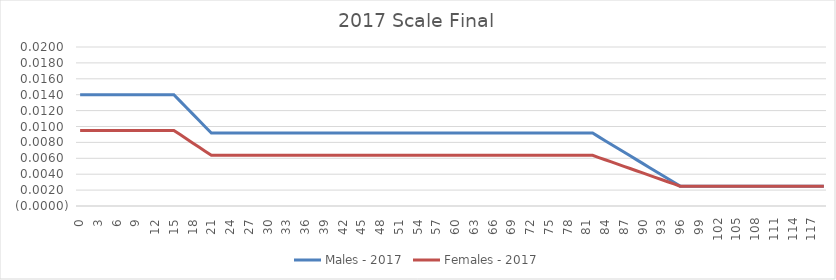
| Category | Males - 2017 | Females - 2017 |
|---|---|---|
| 0.0 | 0.014 | 0.01 |
| 1.0 | 0.014 | 0.01 |
| 2.0 | 0.014 | 0.01 |
| 3.0 | 0.014 | 0.01 |
| 4.0 | 0.014 | 0.01 |
| 5.0 | 0.014 | 0.01 |
| 6.0 | 0.014 | 0.01 |
| 7.0 | 0.014 | 0.01 |
| 8.0 | 0.014 | 0.01 |
| 9.0 | 0.014 | 0.01 |
| 10.0 | 0.014 | 0.01 |
| 11.0 | 0.014 | 0.01 |
| 12.0 | 0.014 | 0.01 |
| 13.0 | 0.014 | 0.01 |
| 14.0 | 0.014 | 0.01 |
| 15.0 | 0.014 | 0.01 |
| 16.0 | 0.013 | 0.009 |
| 17.0 | 0.012 | 0.008 |
| 18.0 | 0.012 | 0.008 |
| 19.0 | 0.011 | 0.007 |
| 20.0 | 0.01 | 0.007 |
| 21.0 | 0.009 | 0.006 |
| 22.0 | 0.009 | 0.006 |
| 23.0 | 0.009 | 0.006 |
| 24.0 | 0.009 | 0.006 |
| 25.0 | 0.009 | 0.006 |
| 26.0 | 0.009 | 0.006 |
| 27.0 | 0.009 | 0.006 |
| 28.0 | 0.009 | 0.006 |
| 29.0 | 0.009 | 0.006 |
| 30.0 | 0.009 | 0.006 |
| 31.0 | 0.009 | 0.006 |
| 32.0 | 0.009 | 0.006 |
| 33.0 | 0.009 | 0.006 |
| 34.0 | 0.009 | 0.006 |
| 35.0 | 0.009 | 0.006 |
| 36.0 | 0.009 | 0.006 |
| 37.0 | 0.009 | 0.006 |
| 38.0 | 0.009 | 0.006 |
| 39.0 | 0.009 | 0.006 |
| 40.0 | 0.009 | 0.006 |
| 41.0 | 0.009 | 0.006 |
| 42.0 | 0.009 | 0.006 |
| 43.0 | 0.009 | 0.006 |
| 44.0 | 0.009 | 0.006 |
| 45.0 | 0.009 | 0.006 |
| 46.0 | 0.009 | 0.006 |
| 47.0 | 0.009 | 0.006 |
| 48.0 | 0.009 | 0.006 |
| 49.0 | 0.009 | 0.006 |
| 50.0 | 0.009 | 0.006 |
| 51.0 | 0.009 | 0.006 |
| 52.0 | 0.009 | 0.006 |
| 53.0 | 0.009 | 0.006 |
| 54.0 | 0.009 | 0.006 |
| 55.0 | 0.009 | 0.006 |
| 56.0 | 0.009 | 0.006 |
| 57.0 | 0.009 | 0.006 |
| 58.0 | 0.009 | 0.006 |
| 59.0 | 0.009 | 0.006 |
| 60.0 | 0.009 | 0.006 |
| 61.0 | 0.009 | 0.006 |
| 62.0 | 0.009 | 0.006 |
| 63.0 | 0.009 | 0.006 |
| 64.0 | 0.009 | 0.006 |
| 65.0 | 0.009 | 0.006 |
| 66.0 | 0.009 | 0.006 |
| 67.0 | 0.009 | 0.006 |
| 68.0 | 0.009 | 0.006 |
| 69.0 | 0.009 | 0.006 |
| 70.0 | 0.009 | 0.006 |
| 71.0 | 0.009 | 0.006 |
| 72.0 | 0.009 | 0.006 |
| 73.0 | 0.009 | 0.006 |
| 74.0 | 0.009 | 0.006 |
| 75.0 | 0.009 | 0.006 |
| 76.0 | 0.009 | 0.006 |
| 77.0 | 0.009 | 0.006 |
| 78.0 | 0.009 | 0.006 |
| 79.0 | 0.009 | 0.006 |
| 80.0 | 0.009 | 0.006 |
| 81.0 | 0.009 | 0.006 |
| 82.0 | 0.009 | 0.006 |
| 83.0 | 0.009 | 0.006 |
| 84.0 | 0.008 | 0.006 |
| 85.0 | 0.008 | 0.006 |
| 86.0 | 0.007 | 0.005 |
| 87.0 | 0.007 | 0.005 |
| 88.0 | 0.006 | 0.005 |
| 89.0 | 0.006 | 0.004 |
| 90.0 | 0.005 | 0.004 |
| 91.0 | 0.005 | 0.004 |
| 92.0 | 0.004 | 0.004 |
| 93.0 | 0.004 | 0.003 |
| 94.0 | 0.003 | 0.003 |
| 95.0 | 0.003 | 0.003 |
| 96.0 | 0.002 | 0.002 |
| 97.0 | 0.002 | 0.002 |
| 98.0 | 0.002 | 0.002 |
| 99.0 | 0.002 | 0.002 |
| 100.0 | 0.002 | 0.002 |
| 101.0 | 0.002 | 0.002 |
| 102.0 | 0.002 | 0.002 |
| 103.0 | 0.002 | 0.002 |
| 104.0 | 0.002 | 0.002 |
| 105.0 | 0.002 | 0.002 |
| 106.0 | 0.002 | 0.002 |
| 107.0 | 0.002 | 0.002 |
| 108.0 | 0.002 | 0.002 |
| 109.0 | 0.002 | 0.002 |
| 110.0 | 0.002 | 0.002 |
| 111.0 | 0.002 | 0.002 |
| 112.0 | 0.002 | 0.002 |
| 113.0 | 0.002 | 0.002 |
| 114.0 | 0.002 | 0.002 |
| 115.0 | 0.002 | 0.002 |
| 116.0 | 0.002 | 0.002 |
| 117.0 | 0.002 | 0.002 |
| 118.0 | 0.002 | 0.002 |
| 119.0 | 0.002 | 0.002 |